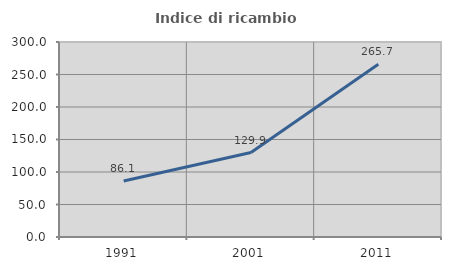
| Category | Indice di ricambio occupazionale  |
|---|---|
| 1991.0 | 86.104 |
| 2001.0 | 129.866 |
| 2011.0 | 265.7 |